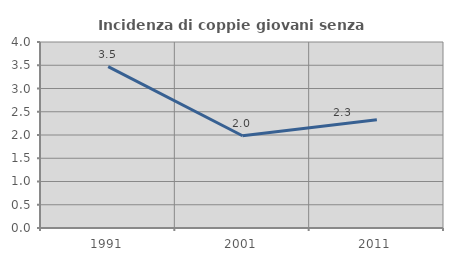
| Category | Incidenza di coppie giovani senza figli |
|---|---|
| 1991.0 | 3.472 |
| 2001.0 | 1.984 |
| 2011.0 | 2.326 |